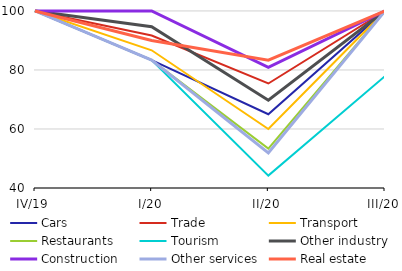
| Category | Cars | Trade | Transport | Restaurants | Tourism | Other industry | Construction | Other services | Real estate |
|---|---|---|---|---|---|---|---|---|---|
| IV/19 | 100 | 100 | 100 | 100 | 100 | 100 | 100 | 100 | 100 |
| I/20 | 83.333 | 91.675 | 86.667 | 83.333 | 83.333 | 94.673 | 100 | 83.333 | 90 |
| II/20 | 65 | 75.419 | 60 | 53.333 | 44.193 | 69.755 | 80.885 | 51.918 | 83.333 |
| III/20 | 100 | 100 | 100 | 100 | 77.899 | 100 | 100 | 100 | 100 |